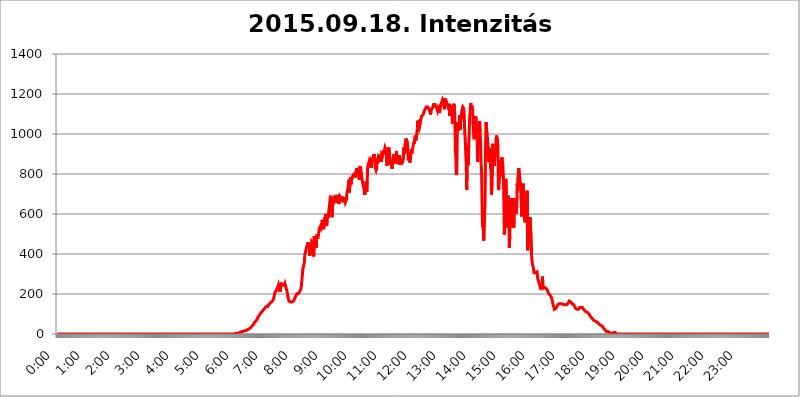
| Category | 2015.09.18. Intenzitás [W/m^2] |
|---|---|
| 0.0 | 0 |
| 0.0006944444444444445 | 0 |
| 0.001388888888888889 | 0 |
| 0.0020833333333333333 | 0 |
| 0.002777777777777778 | 0 |
| 0.003472222222222222 | 0 |
| 0.004166666666666667 | 0 |
| 0.004861111111111111 | 0 |
| 0.005555555555555556 | 0 |
| 0.0062499999999999995 | 0 |
| 0.006944444444444444 | 0 |
| 0.007638888888888889 | 0 |
| 0.008333333333333333 | 0 |
| 0.009027777777777779 | 0 |
| 0.009722222222222222 | 0 |
| 0.010416666666666666 | 0 |
| 0.011111111111111112 | 0 |
| 0.011805555555555555 | 0 |
| 0.012499999999999999 | 0 |
| 0.013194444444444444 | 0 |
| 0.013888888888888888 | 0 |
| 0.014583333333333332 | 0 |
| 0.015277777777777777 | 0 |
| 0.015972222222222224 | 0 |
| 0.016666666666666666 | 0 |
| 0.017361111111111112 | 0 |
| 0.018055555555555557 | 0 |
| 0.01875 | 0 |
| 0.019444444444444445 | 0 |
| 0.02013888888888889 | 0 |
| 0.020833333333333332 | 0 |
| 0.02152777777777778 | 0 |
| 0.022222222222222223 | 0 |
| 0.02291666666666667 | 0 |
| 0.02361111111111111 | 0 |
| 0.024305555555555556 | 0 |
| 0.024999999999999998 | 0 |
| 0.025694444444444447 | 0 |
| 0.02638888888888889 | 0 |
| 0.027083333333333334 | 0 |
| 0.027777777777777776 | 0 |
| 0.02847222222222222 | 0 |
| 0.029166666666666664 | 0 |
| 0.029861111111111113 | 0 |
| 0.030555555555555555 | 0 |
| 0.03125 | 0 |
| 0.03194444444444445 | 0 |
| 0.03263888888888889 | 0 |
| 0.03333333333333333 | 0 |
| 0.034027777777777775 | 0 |
| 0.034722222222222224 | 0 |
| 0.035416666666666666 | 0 |
| 0.036111111111111115 | 0 |
| 0.03680555555555556 | 0 |
| 0.0375 | 0 |
| 0.03819444444444444 | 0 |
| 0.03888888888888889 | 0 |
| 0.03958333333333333 | 0 |
| 0.04027777777777778 | 0 |
| 0.04097222222222222 | 0 |
| 0.041666666666666664 | 0 |
| 0.042361111111111106 | 0 |
| 0.04305555555555556 | 0 |
| 0.043750000000000004 | 0 |
| 0.044444444444444446 | 0 |
| 0.04513888888888889 | 0 |
| 0.04583333333333334 | 0 |
| 0.04652777777777778 | 0 |
| 0.04722222222222222 | 0 |
| 0.04791666666666666 | 0 |
| 0.04861111111111111 | 0 |
| 0.049305555555555554 | 0 |
| 0.049999999999999996 | 0 |
| 0.05069444444444445 | 0 |
| 0.051388888888888894 | 0 |
| 0.052083333333333336 | 0 |
| 0.05277777777777778 | 0 |
| 0.05347222222222222 | 0 |
| 0.05416666666666667 | 0 |
| 0.05486111111111111 | 0 |
| 0.05555555555555555 | 0 |
| 0.05625 | 0 |
| 0.05694444444444444 | 0 |
| 0.057638888888888885 | 0 |
| 0.05833333333333333 | 0 |
| 0.05902777777777778 | 0 |
| 0.059722222222222225 | 0 |
| 0.06041666666666667 | 0 |
| 0.061111111111111116 | 0 |
| 0.06180555555555556 | 0 |
| 0.0625 | 0 |
| 0.06319444444444444 | 0 |
| 0.06388888888888888 | 0 |
| 0.06458333333333334 | 0 |
| 0.06527777777777778 | 0 |
| 0.06597222222222222 | 0 |
| 0.06666666666666667 | 0 |
| 0.06736111111111111 | 0 |
| 0.06805555555555555 | 0 |
| 0.06874999999999999 | 0 |
| 0.06944444444444443 | 0 |
| 0.07013888888888889 | 0 |
| 0.07083333333333333 | 0 |
| 0.07152777777777779 | 0 |
| 0.07222222222222223 | 0 |
| 0.07291666666666667 | 0 |
| 0.07361111111111111 | 0 |
| 0.07430555555555556 | 0 |
| 0.075 | 0 |
| 0.07569444444444444 | 0 |
| 0.0763888888888889 | 0 |
| 0.07708333333333334 | 0 |
| 0.07777777777777778 | 0 |
| 0.07847222222222222 | 0 |
| 0.07916666666666666 | 0 |
| 0.0798611111111111 | 0 |
| 0.08055555555555556 | 0 |
| 0.08125 | 0 |
| 0.08194444444444444 | 0 |
| 0.08263888888888889 | 0 |
| 0.08333333333333333 | 0 |
| 0.08402777777777777 | 0 |
| 0.08472222222222221 | 0 |
| 0.08541666666666665 | 0 |
| 0.08611111111111112 | 0 |
| 0.08680555555555557 | 0 |
| 0.08750000000000001 | 0 |
| 0.08819444444444445 | 0 |
| 0.08888888888888889 | 0 |
| 0.08958333333333333 | 0 |
| 0.09027777777777778 | 0 |
| 0.09097222222222222 | 0 |
| 0.09166666666666667 | 0 |
| 0.09236111111111112 | 0 |
| 0.09305555555555556 | 0 |
| 0.09375 | 0 |
| 0.09444444444444444 | 0 |
| 0.09513888888888888 | 0 |
| 0.09583333333333333 | 0 |
| 0.09652777777777777 | 0 |
| 0.09722222222222222 | 0 |
| 0.09791666666666667 | 0 |
| 0.09861111111111111 | 0 |
| 0.09930555555555555 | 0 |
| 0.09999999999999999 | 0 |
| 0.10069444444444443 | 0 |
| 0.1013888888888889 | 0 |
| 0.10208333333333335 | 0 |
| 0.10277777777777779 | 0 |
| 0.10347222222222223 | 0 |
| 0.10416666666666667 | 0 |
| 0.10486111111111111 | 0 |
| 0.10555555555555556 | 0 |
| 0.10625 | 0 |
| 0.10694444444444444 | 0 |
| 0.1076388888888889 | 0 |
| 0.10833333333333334 | 0 |
| 0.10902777777777778 | 0 |
| 0.10972222222222222 | 0 |
| 0.1111111111111111 | 0 |
| 0.11180555555555556 | 0 |
| 0.11180555555555556 | 0 |
| 0.1125 | 0 |
| 0.11319444444444444 | 0 |
| 0.11388888888888889 | 0 |
| 0.11458333333333333 | 0 |
| 0.11527777777777777 | 0 |
| 0.11597222222222221 | 0 |
| 0.11666666666666665 | 0 |
| 0.1173611111111111 | 0 |
| 0.11805555555555557 | 0 |
| 0.11944444444444445 | 0 |
| 0.12013888888888889 | 0 |
| 0.12083333333333333 | 0 |
| 0.12152777777777778 | 0 |
| 0.12222222222222223 | 0 |
| 0.12291666666666667 | 0 |
| 0.12291666666666667 | 0 |
| 0.12361111111111112 | 0 |
| 0.12430555555555556 | 0 |
| 0.125 | 0 |
| 0.12569444444444444 | 0 |
| 0.12638888888888888 | 0 |
| 0.12708333333333333 | 0 |
| 0.16875 | 0 |
| 0.12847222222222224 | 0 |
| 0.12916666666666668 | 0 |
| 0.12986111111111112 | 0 |
| 0.13055555555555556 | 0 |
| 0.13125 | 0 |
| 0.13194444444444445 | 0 |
| 0.1326388888888889 | 0 |
| 0.13333333333333333 | 0 |
| 0.13402777777777777 | 0 |
| 0.13402777777777777 | 0 |
| 0.13472222222222222 | 0 |
| 0.13541666666666666 | 0 |
| 0.1361111111111111 | 0 |
| 0.13749999999999998 | 0 |
| 0.13819444444444443 | 0 |
| 0.1388888888888889 | 0 |
| 0.13958333333333334 | 0 |
| 0.14027777777777778 | 0 |
| 0.14097222222222222 | 0 |
| 0.14166666666666666 | 0 |
| 0.1423611111111111 | 0 |
| 0.14305555555555557 | 0 |
| 0.14375000000000002 | 0 |
| 0.14444444444444446 | 0 |
| 0.1451388888888889 | 0 |
| 0.1451388888888889 | 0 |
| 0.14652777777777778 | 0 |
| 0.14722222222222223 | 0 |
| 0.14791666666666667 | 0 |
| 0.1486111111111111 | 0 |
| 0.14930555555555555 | 0 |
| 0.15 | 0 |
| 0.15069444444444444 | 0 |
| 0.15138888888888888 | 0 |
| 0.15208333333333332 | 0 |
| 0.15277777777777776 | 0 |
| 0.15347222222222223 | 0 |
| 0.15416666666666667 | 0 |
| 0.15486111111111112 | 0 |
| 0.15555555555555556 | 0 |
| 0.15625 | 0 |
| 0.15694444444444444 | 0 |
| 0.15763888888888888 | 0 |
| 0.15833333333333333 | 0 |
| 0.15902777777777777 | 0 |
| 0.15972222222222224 | 0 |
| 0.16041666666666668 | 0 |
| 0.16111111111111112 | 0 |
| 0.16180555555555556 | 0 |
| 0.1625 | 0 |
| 0.16319444444444445 | 0 |
| 0.1638888888888889 | 0 |
| 0.16458333333333333 | 0 |
| 0.16527777777777777 | 0 |
| 0.16597222222222222 | 0 |
| 0.16666666666666666 | 0 |
| 0.1673611111111111 | 0 |
| 0.16805555555555554 | 0 |
| 0.16874999999999998 | 0 |
| 0.16944444444444443 | 0 |
| 0.17013888888888887 | 0 |
| 0.1708333333333333 | 0 |
| 0.17152777777777775 | 0 |
| 0.17222222222222225 | 0 |
| 0.1729166666666667 | 0 |
| 0.17361111111111113 | 0 |
| 0.17430555555555557 | 0 |
| 0.17500000000000002 | 0 |
| 0.17569444444444446 | 0 |
| 0.1763888888888889 | 0 |
| 0.17708333333333334 | 0 |
| 0.17777777777777778 | 0 |
| 0.17847222222222223 | 0 |
| 0.17916666666666667 | 0 |
| 0.1798611111111111 | 0 |
| 0.18055555555555555 | 0 |
| 0.18125 | 0 |
| 0.18194444444444444 | 0 |
| 0.1826388888888889 | 0 |
| 0.18333333333333335 | 0 |
| 0.1840277777777778 | 0 |
| 0.18472222222222223 | 0 |
| 0.18541666666666667 | 0 |
| 0.18611111111111112 | 0 |
| 0.18680555555555556 | 0 |
| 0.1875 | 0 |
| 0.18819444444444444 | 0 |
| 0.18888888888888888 | 0 |
| 0.18958333333333333 | 0 |
| 0.19027777777777777 | 0 |
| 0.1909722222222222 | 0 |
| 0.19166666666666665 | 0 |
| 0.19236111111111112 | 0 |
| 0.19305555555555554 | 0 |
| 0.19375 | 0 |
| 0.19444444444444445 | 0 |
| 0.1951388888888889 | 0 |
| 0.19583333333333333 | 0 |
| 0.19652777777777777 | 0 |
| 0.19722222222222222 | 0 |
| 0.19791666666666666 | 0 |
| 0.1986111111111111 | 0 |
| 0.19930555555555554 | 0 |
| 0.19999999999999998 | 0 |
| 0.20069444444444443 | 0 |
| 0.20138888888888887 | 0 |
| 0.2020833333333333 | 0 |
| 0.2027777777777778 | 0 |
| 0.2034722222222222 | 0 |
| 0.2041666666666667 | 0 |
| 0.20486111111111113 | 0 |
| 0.20555555555555557 | 0 |
| 0.20625000000000002 | 0 |
| 0.20694444444444446 | 0 |
| 0.2076388888888889 | 0 |
| 0.20833333333333334 | 0 |
| 0.20902777777777778 | 0 |
| 0.20972222222222223 | 0 |
| 0.21041666666666667 | 0 |
| 0.2111111111111111 | 0 |
| 0.21180555555555555 | 0 |
| 0.2125 | 0 |
| 0.21319444444444444 | 0 |
| 0.2138888888888889 | 0 |
| 0.21458333333333335 | 0 |
| 0.2152777777777778 | 0 |
| 0.21597222222222223 | 0 |
| 0.21666666666666667 | 0 |
| 0.21736111111111112 | 0 |
| 0.21805555555555556 | 0 |
| 0.21875 | 0 |
| 0.21944444444444444 | 0 |
| 0.22013888888888888 | 0 |
| 0.22083333333333333 | 0 |
| 0.22152777777777777 | 0 |
| 0.2222222222222222 | 0 |
| 0.22291666666666665 | 0 |
| 0.2236111111111111 | 0 |
| 0.22430555555555556 | 0 |
| 0.225 | 0 |
| 0.22569444444444445 | 0 |
| 0.2263888888888889 | 0 |
| 0.22708333333333333 | 0 |
| 0.22777777777777777 | 0 |
| 0.22847222222222222 | 0 |
| 0.22916666666666666 | 0 |
| 0.2298611111111111 | 0 |
| 0.23055555555555554 | 0 |
| 0.23124999999999998 | 0 |
| 0.23194444444444443 | 0 |
| 0.23263888888888887 | 0 |
| 0.2333333333333333 | 0 |
| 0.2340277777777778 | 0 |
| 0.2347222222222222 | 0 |
| 0.2354166666666667 | 0 |
| 0.23611111111111113 | 0 |
| 0.23680555555555557 | 0 |
| 0.23750000000000002 | 0 |
| 0.23819444444444446 | 0 |
| 0.2388888888888889 | 0 |
| 0.23958333333333334 | 0 |
| 0.24027777777777778 | 0 |
| 0.24097222222222223 | 0 |
| 0.24166666666666667 | 0 |
| 0.2423611111111111 | 0 |
| 0.24305555555555555 | 0 |
| 0.24375 | 0 |
| 0.24444444444444446 | 0 |
| 0.24513888888888888 | 0 |
| 0.24583333333333335 | 0 |
| 0.2465277777777778 | 0 |
| 0.24722222222222223 | 0 |
| 0.24791666666666667 | 0 |
| 0.24861111111111112 | 0 |
| 0.24930555555555556 | 0 |
| 0.25 | 3.525 |
| 0.25069444444444444 | 3.525 |
| 0.2513888888888889 | 3.525 |
| 0.2520833333333333 | 3.525 |
| 0.25277777777777777 | 7.887 |
| 0.2534722222222222 | 3.525 |
| 0.25416666666666665 | 3.525 |
| 0.2548611111111111 | 3.525 |
| 0.2555555555555556 | 3.525 |
| 0.25625000000000003 | 7.887 |
| 0.2569444444444445 | 7.887 |
| 0.2576388888888889 | 12.257 |
| 0.25833333333333336 | 12.257 |
| 0.2590277777777778 | 12.257 |
| 0.25972222222222224 | 12.257 |
| 0.2604166666666667 | 12.257 |
| 0.2611111111111111 | 12.257 |
| 0.26180555555555557 | 12.257 |
| 0.2625 | 16.636 |
| 0.26319444444444445 | 16.636 |
| 0.2638888888888889 | 16.636 |
| 0.26458333333333334 | 16.636 |
| 0.2652777777777778 | 21.024 |
| 0.2659722222222222 | 21.024 |
| 0.26666666666666666 | 21.024 |
| 0.2673611111111111 | 21.024 |
| 0.26805555555555555 | 21.024 |
| 0.26875 | 25.419 |
| 0.26944444444444443 | 25.419 |
| 0.2701388888888889 | 29.823 |
| 0.2708333333333333 | 29.823 |
| 0.27152777777777776 | 34.234 |
| 0.2722222222222222 | 34.234 |
| 0.27291666666666664 | 38.653 |
| 0.2736111111111111 | 43.079 |
| 0.2743055555555555 | 43.079 |
| 0.27499999999999997 | 47.511 |
| 0.27569444444444446 | 51.951 |
| 0.27638888888888885 | 56.398 |
| 0.27708333333333335 | 56.398 |
| 0.2777777777777778 | 60.85 |
| 0.27847222222222223 | 65.31 |
| 0.2791666666666667 | 65.31 |
| 0.2798611111111111 | 69.775 |
| 0.28055555555555556 | 74.246 |
| 0.28125 | 83.205 |
| 0.28194444444444444 | 83.205 |
| 0.2826388888888889 | 87.692 |
| 0.2833333333333333 | 92.184 |
| 0.28402777777777777 | 96.682 |
| 0.2847222222222222 | 101.184 |
| 0.28541666666666665 | 101.184 |
| 0.28611111111111115 | 105.69 |
| 0.28680555555555554 | 110.201 |
| 0.28750000000000003 | 110.201 |
| 0.2881944444444445 | 114.716 |
| 0.2888888888888889 | 119.235 |
| 0.28958333333333336 | 119.235 |
| 0.2902777777777778 | 123.758 |
| 0.29097222222222224 | 128.284 |
| 0.2916666666666667 | 128.284 |
| 0.2923611111111111 | 132.814 |
| 0.29305555555555557 | 137.347 |
| 0.29375 | 137.347 |
| 0.29444444444444445 | 137.347 |
| 0.2951388888888889 | 137.347 |
| 0.29583333333333334 | 141.884 |
| 0.2965277777777778 | 146.423 |
| 0.2972222222222222 | 150.964 |
| 0.29791666666666666 | 150.964 |
| 0.2986111111111111 | 155.509 |
| 0.29930555555555555 | 160.056 |
| 0.3 | 160.056 |
| 0.30069444444444443 | 160.056 |
| 0.3013888888888889 | 164.605 |
| 0.3020833333333333 | 164.605 |
| 0.30277777777777776 | 169.156 |
| 0.3034722222222222 | 173.709 |
| 0.30416666666666664 | 187.378 |
| 0.3048611111111111 | 201.058 |
| 0.3055555555555555 | 210.182 |
| 0.30624999999999997 | 214.746 |
| 0.3069444444444444 | 214.746 |
| 0.3076388888888889 | 219.309 |
| 0.30833333333333335 | 228.436 |
| 0.3090277777777778 | 233 |
| 0.30972222222222223 | 237.564 |
| 0.3104166666666667 | 246.689 |
| 0.3111111111111111 | 237.564 |
| 0.31180555555555556 | 233 |
| 0.3125 | 210.182 |
| 0.31319444444444444 | 228.436 |
| 0.3138888888888889 | 242.127 |
| 0.3145833333333333 | 251.251 |
| 0.31527777777777777 | 251.251 |
| 0.3159722222222222 | 255.813 |
| 0.31666666666666665 | 246.689 |
| 0.31736111111111115 | 251.251 |
| 0.31805555555555554 | 242.127 |
| 0.31875000000000003 | 242.127 |
| 0.3194444444444445 | 251.251 |
| 0.3201388888888889 | 255.813 |
| 0.32083333333333336 | 233 |
| 0.3215277777777778 | 237.564 |
| 0.32222222222222224 | 214.746 |
| 0.3229166666666667 | 196.497 |
| 0.3236111111111111 | 182.82 |
| 0.32430555555555557 | 173.709 |
| 0.325 | 164.605 |
| 0.32569444444444445 | 164.605 |
| 0.3263888888888889 | 164.605 |
| 0.32708333333333334 | 160.056 |
| 0.3277777777777778 | 160.056 |
| 0.3284722222222222 | 160.056 |
| 0.32916666666666666 | 160.056 |
| 0.3298611111111111 | 164.605 |
| 0.33055555555555555 | 164.605 |
| 0.33125 | 164.605 |
| 0.33194444444444443 | 169.156 |
| 0.3326388888888889 | 173.709 |
| 0.3333333333333333 | 182.82 |
| 0.3340277777777778 | 187.378 |
| 0.3347222222222222 | 191.937 |
| 0.3354166666666667 | 196.497 |
| 0.3361111111111111 | 201.058 |
| 0.3368055555555556 | 201.058 |
| 0.33749999999999997 | 201.058 |
| 0.33819444444444446 | 201.058 |
| 0.33888888888888885 | 205.62 |
| 0.33958333333333335 | 210.182 |
| 0.34027777777777773 | 210.182 |
| 0.34097222222222223 | 210.182 |
| 0.3416666666666666 | 223.873 |
| 0.3423611111111111 | 242.127 |
| 0.3430555555555555 | 264.932 |
| 0.34375 | 292.259 |
| 0.3444444444444445 | 324.052 |
| 0.3451388888888889 | 324.052 |
| 0.3458333333333334 | 324.052 |
| 0.34652777777777777 | 355.712 |
| 0.34722222222222227 | 396.164 |
| 0.34791666666666665 | 405.108 |
| 0.34861111111111115 | 405.108 |
| 0.34930555555555554 | 409.574 |
| 0.35000000000000003 | 440.702 |
| 0.3506944444444444 | 431.833 |
| 0.3513888888888889 | 458.38 |
| 0.3520833333333333 | 453.968 |
| 0.3527777777777778 | 440.702 |
| 0.3534722222222222 | 449.551 |
| 0.3541666666666667 | 391.685 |
| 0.3548611111111111 | 422.943 |
| 0.35555555555555557 | 418.492 |
| 0.35625 | 396.164 |
| 0.35694444444444445 | 458.38 |
| 0.3576388888888889 | 453.968 |
| 0.35833333333333334 | 449.551 |
| 0.3590277777777778 | 440.702 |
| 0.3597222222222222 | 387.202 |
| 0.36041666666666666 | 489.108 |
| 0.3611111111111111 | 471.582 |
| 0.36180555555555555 | 471.582 |
| 0.3625 | 467.187 |
| 0.36319444444444443 | 431.833 |
| 0.3638888888888889 | 489.108 |
| 0.3645833333333333 | 493.475 |
| 0.3652777777777778 | 489.108 |
| 0.3659722222222222 | 484.735 |
| 0.3666666666666667 | 484.735 |
| 0.3673611111111111 | 523.88 |
| 0.3680555555555556 | 528.2 |
| 0.36874999999999997 | 528.2 |
| 0.36944444444444446 | 541.121 |
| 0.37013888888888885 | 532.513 |
| 0.37083333333333335 | 541.121 |
| 0.37152777777777773 | 571.049 |
| 0.37222222222222223 | 575.299 |
| 0.3729166666666666 | 575.299 |
| 0.3736111111111111 | 523.88 |
| 0.3743055555555555 | 545.416 |
| 0.375 | 583.779 |
| 0.3756944444444445 | 575.299 |
| 0.3763888888888889 | 571.049 |
| 0.3770833333333334 | 600.661 |
| 0.37777777777777777 | 541.121 |
| 0.37847222222222227 | 566.793 |
| 0.37916666666666665 | 596.45 |
| 0.37986111111111115 | 579.542 |
| 0.38055555555555554 | 600.661 |
| 0.38125000000000003 | 625.784 |
| 0.3819444444444444 | 646.537 |
| 0.3826388888888889 | 675.311 |
| 0.3833333333333333 | 691.608 |
| 0.3840277777777778 | 638.256 |
| 0.3847222222222222 | 642.4 |
| 0.3854166666666667 | 583.779 |
| 0.3861111111111111 | 634.105 |
| 0.38680555555555557 | 629.948 |
| 0.3875 | 675.311 |
| 0.38819444444444445 | 679.395 |
| 0.3888888888888889 | 667.123 |
| 0.38958333333333334 | 675.311 |
| 0.3902777777777778 | 695.666 |
| 0.3909722222222222 | 675.311 |
| 0.39166666666666666 | 671.22 |
| 0.3923611111111111 | 654.791 |
| 0.39305555555555555 | 667.123 |
| 0.39375 | 695.666 |
| 0.39444444444444443 | 667.123 |
| 0.3951388888888889 | 650.667 |
| 0.3958333333333333 | 671.22 |
| 0.3965277777777778 | 687.544 |
| 0.3972222222222222 | 687.544 |
| 0.3979166666666667 | 687.544 |
| 0.3986111111111111 | 675.311 |
| 0.3993055555555556 | 687.544 |
| 0.39999999999999997 | 687.544 |
| 0.40069444444444446 | 683.473 |
| 0.40138888888888885 | 658.909 |
| 0.40208333333333335 | 683.473 |
| 0.40277777777777773 | 663.019 |
| 0.40347222222222223 | 675.311 |
| 0.4041666666666666 | 658.909 |
| 0.4048611111111111 | 658.909 |
| 0.4055555555555555 | 671.22 |
| 0.40625 | 703.762 |
| 0.4069444444444445 | 715.858 |
| 0.4076388888888889 | 711.832 |
| 0.4083333333333334 | 743.859 |
| 0.40902777777777777 | 771.559 |
| 0.40972222222222227 | 707.8 |
| 0.41041666666666665 | 755.766 |
| 0.41111111111111115 | 783.342 |
| 0.41180555555555554 | 747.834 |
| 0.41250000000000003 | 763.674 |
| 0.4131944444444444 | 775.492 |
| 0.4138888888888889 | 791.169 |
| 0.4145833333333333 | 779.42 |
| 0.4152777777777778 | 795.074 |
| 0.4159722222222222 | 795.074 |
| 0.4166666666666667 | 795.074 |
| 0.4173611111111111 | 802.868 |
| 0.41805555555555557 | 798.974 |
| 0.41875 | 783.342 |
| 0.41944444444444445 | 814.519 |
| 0.4201388888888889 | 829.981 |
| 0.42083333333333334 | 814.519 |
| 0.4215277777777778 | 814.519 |
| 0.4222222222222222 | 822.26 |
| 0.42291666666666666 | 787.258 |
| 0.4236111111111111 | 771.559 |
| 0.42430555555555555 | 791.169 |
| 0.425 | 837.682 |
| 0.42569444444444443 | 822.26 |
| 0.4263888888888889 | 806.757 |
| 0.4270833333333333 | 802.868 |
| 0.4277777777777778 | 767.62 |
| 0.4284722222222222 | 767.62 |
| 0.4291666666666667 | 743.859 |
| 0.4298611111111111 | 739.877 |
| 0.4305555555555556 | 719.877 |
| 0.43124999999999997 | 695.666 |
| 0.43194444444444446 | 711.832 |
| 0.43263888888888885 | 731.896 |
| 0.43333333333333335 | 763.674 |
| 0.43402777777777773 | 711.832 |
| 0.43472222222222223 | 759.723 |
| 0.4354166666666666 | 837.682 |
| 0.4361111111111111 | 841.526 |
| 0.4368055555555555 | 837.682 |
| 0.4375 | 864.493 |
| 0.4381944444444445 | 856.855 |
| 0.4388888888888889 | 864.493 |
| 0.4395833333333334 | 853.029 |
| 0.44027777777777777 | 829.981 |
| 0.44097222222222227 | 856.855 |
| 0.44166666666666665 | 860.676 |
| 0.44236111111111115 | 875.918 |
| 0.44305555555555554 | 872.114 |
| 0.44375000000000003 | 860.676 |
| 0.4444444444444444 | 898.668 |
| 0.4451388888888889 | 879.719 |
| 0.4458333333333333 | 837.682 |
| 0.4465277777777778 | 826.123 |
| 0.4472222222222222 | 818.392 |
| 0.4479166666666667 | 826.123 |
| 0.4486111111111111 | 879.719 |
| 0.44930555555555557 | 853.029 |
| 0.45 | 875.918 |
| 0.45069444444444445 | 891.099 |
| 0.4513888888888889 | 891.099 |
| 0.45208333333333334 | 887.309 |
| 0.4527777777777778 | 883.516 |
| 0.4534722222222222 | 891.099 |
| 0.45416666666666666 | 860.676 |
| 0.4548611111111111 | 898.668 |
| 0.45555555555555555 | 894.885 |
| 0.45625 | 891.099 |
| 0.45694444444444443 | 891.099 |
| 0.4576388888888889 | 917.534 |
| 0.4583333333333333 | 902.447 |
| 0.4590277777777778 | 921.298 |
| 0.4597222222222222 | 932.576 |
| 0.4604166666666667 | 925.06 |
| 0.4611111111111111 | 894.885 |
| 0.4618055555555556 | 913.766 |
| 0.46249999999999997 | 841.526 |
| 0.46319444444444446 | 883.516 |
| 0.46388888888888885 | 909.996 |
| 0.46458333333333335 | 925.06 |
| 0.46527777777777773 | 932.576 |
| 0.46597222222222223 | 875.918 |
| 0.4666666666666666 | 872.114 |
| 0.4673611111111111 | 879.719 |
| 0.4680555555555555 | 845.365 |
| 0.46875 | 868.305 |
| 0.4694444444444445 | 826.123 |
| 0.4701388888888889 | 853.029 |
| 0.4708333333333334 | 879.719 |
| 0.47152777777777777 | 875.918 |
| 0.47222222222222227 | 898.668 |
| 0.47291666666666665 | 879.719 |
| 0.47361111111111115 | 868.305 |
| 0.47430555555555554 | 853.029 |
| 0.47500000000000003 | 891.099 |
| 0.4756944444444444 | 913.766 |
| 0.4763888888888889 | 868.305 |
| 0.4770833333333333 | 849.199 |
| 0.4777777777777778 | 860.676 |
| 0.4784722222222222 | 868.305 |
| 0.4791666666666667 | 868.305 |
| 0.4798611111111111 | 894.885 |
| 0.48055555555555557 | 864.493 |
| 0.48125 | 875.918 |
| 0.48194444444444445 | 845.365 |
| 0.4826388888888889 | 849.199 |
| 0.48333333333333334 | 864.493 |
| 0.4840277777777778 | 853.029 |
| 0.4847222222222222 | 853.029 |
| 0.48541666666666666 | 887.309 |
| 0.4861111111111111 | 932.576 |
| 0.48680555555555555 | 909.996 |
| 0.4875 | 902.447 |
| 0.48819444444444443 | 951.327 |
| 0.4888888888888889 | 977.508 |
| 0.4895833333333333 | 973.772 |
| 0.4902777777777778 | 973.772 |
| 0.4909722222222222 | 958.814 |
| 0.4916666666666667 | 925.06 |
| 0.4923611111111111 | 868.305 |
| 0.4930555555555556 | 906.223 |
| 0.49374999999999997 | 883.516 |
| 0.49444444444444446 | 856.855 |
| 0.49513888888888885 | 864.493 |
| 0.49583333333333335 | 898.668 |
| 0.49652777777777773 | 925.06 |
| 0.49722222222222223 | 902.447 |
| 0.4979166666666666 | 917.534 |
| 0.4986111111111111 | 928.819 |
| 0.4993055555555555 | 928.819 |
| 0.5 | 958.814 |
| 0.5006944444444444 | 951.327 |
| 0.5013888888888889 | 973.772 |
| 0.5020833333333333 | 992.448 |
| 0.5027777777777778 | 966.295 |
| 0.5034722222222222 | 966.295 |
| 0.5041666666666667 | 996.182 |
| 0.5048611111111111 | 1022.323 |
| 0.5055555555555555 | 1067.267 |
| 0.50625 | 1059.756 |
| 0.5069444444444444 | 1037.277 |
| 0.5076388888888889 | 1026.06 |
| 0.5083333333333333 | 1033.537 |
| 0.5090277777777777 | 1074.789 |
| 0.5097222222222222 | 1067.267 |
| 0.5104166666666666 | 1067.267 |
| 0.5111111111111112 | 1089.873 |
| 0.5118055555555555 | 1089.873 |
| 0.5125000000000001 | 1086.097 |
| 0.5131944444444444 | 1097.437 |
| 0.513888888888889 | 1093.653 |
| 0.5145833333333333 | 1101.226 |
| 0.5152777777777778 | 1120.238 |
| 0.5159722222222222 | 1120.238 |
| 0.5166666666666667 | 1127.879 |
| 0.517361111111111 | 1135.543 |
| 0.5180555555555556 | 1135.543 |
| 0.5187499999999999 | 1131.708 |
| 0.5194444444444445 | 1135.543 |
| 0.5201388888888888 | 1135.543 |
| 0.5208333333333334 | 1131.708 |
| 0.5215277777777778 | 1124.056 |
| 0.5222222222222223 | 1116.426 |
| 0.5229166666666667 | 1116.426 |
| 0.5236111111111111 | 1097.437 |
| 0.5243055555555556 | 1120.238 |
| 0.525 | 1120.238 |
| 0.5256944444444445 | 1124.056 |
| 0.5263888888888889 | 1131.708 |
| 0.5270833333333333 | 1139.384 |
| 0.5277777777777778 | 1147.086 |
| 0.5284722222222222 | 1147.086 |
| 0.5291666666666667 | 1150.946 |
| 0.5298611111111111 | 1147.086 |
| 0.5305555555555556 | 1139.384 |
| 0.53125 | 1135.543 |
| 0.5319444444444444 | 1131.708 |
| 0.5326388888888889 | 1124.056 |
| 0.5333333333333333 | 1116.426 |
| 0.5340277777777778 | 1127.879 |
| 0.5347222222222222 | 1131.708 |
| 0.5354166666666667 | 1112.618 |
| 0.5361111111111111 | 1105.019 |
| 0.5368055555555555 | 1120.238 |
| 0.5375 | 1143.232 |
| 0.5381944444444444 | 1143.232 |
| 0.5388888888888889 | 1139.384 |
| 0.5395833333333333 | 1162.571 |
| 0.5402777777777777 | 1170.358 |
| 0.5409722222222222 | 1174.263 |
| 0.5416666666666666 | 1154.814 |
| 0.5423611111111112 | 1154.814 |
| 0.5430555555555555 | 1124.056 |
| 0.5437500000000001 | 1178.177 |
| 0.5444444444444444 | 1170.358 |
| 0.545138888888889 | 1170.358 |
| 0.5458333333333333 | 1162.571 |
| 0.5465277777777778 | 1162.571 |
| 0.5472222222222222 | 1158.689 |
| 0.5479166666666667 | 1135.543 |
| 0.548611111111111 | 1131.708 |
| 0.5493055555555556 | 1143.232 |
| 0.5499999999999999 | 1150.946 |
| 0.5506944444444445 | 1089.873 |
| 0.5513888888888888 | 1120.238 |
| 0.5520833333333334 | 1143.232 |
| 0.5527777777777778 | 1143.232 |
| 0.5534722222222223 | 1112.618 |
| 0.5541666666666667 | 1052.255 |
| 0.5548611111111111 | 1120.238 |
| 0.5555555555555556 | 1108.816 |
| 0.55625 | 1150.946 |
| 0.5569444444444445 | 1131.708 |
| 0.5576388888888889 | 1093.653 |
| 0.5583333333333333 | 928.819 |
| 0.5590277777777778 | 883.516 |
| 0.5597222222222222 | 795.074 |
| 0.5604166666666667 | 806.757 |
| 0.5611111111111111 | 1018.587 |
| 0.5618055555555556 | 1059.756 |
| 0.5625 | 1014.852 |
| 0.5631944444444444 | 1048.508 |
| 0.5638888888888889 | 1041.019 |
| 0.5645833333333333 | 1093.653 |
| 0.5652777777777778 | 1022.323 |
| 0.5659722222222222 | 1071.027 |
| 0.5666666666666667 | 1078.555 |
| 0.5673611111111111 | 1116.426 |
| 0.5680555555555555 | 1127.879 |
| 0.56875 | 1135.543 |
| 0.5694444444444444 | 1131.708 |
| 0.5701388888888889 | 1127.879 |
| 0.5708333333333333 | 1093.653 |
| 0.5715277777777777 | 1003.65 |
| 0.5722222222222222 | 977.508 |
| 0.5729166666666666 | 898.668 |
| 0.5736111111111112 | 856.855 |
| 0.5743055555555555 | 719.877 |
| 0.5750000000000001 | 864.493 |
| 0.5756944444444444 | 891.099 |
| 0.576388888888889 | 845.365 |
| 0.5770833333333333 | 947.58 |
| 0.5777777777777778 | 999.916 |
| 0.5784722222222222 | 1089.873 |
| 0.5791666666666667 | 1108.816 |
| 0.579861111111111 | 1154.814 |
| 0.5805555555555556 | 1120.238 |
| 0.5812499999999999 | 1143.232 |
| 0.5819444444444445 | 1147.086 |
| 0.5826388888888888 | 1120.238 |
| 0.5833333333333334 | 1041.019 |
| 0.5840277777777778 | 1007.383 |
| 0.5847222222222223 | 973.772 |
| 0.5854166666666667 | 1059.756 |
| 0.5861111111111111 | 1067.267 |
| 0.5868055555555556 | 1089.873 |
| 0.5875 | 1067.267 |
| 0.5881944444444445 | 1029.798 |
| 0.5888888888888889 | 992.448 |
| 0.5895833333333333 | 860.676 |
| 0.5902777777777778 | 856.855 |
| 0.5909722222222222 | 988.714 |
| 0.5916666666666667 | 1052.255 |
| 0.5923611111111111 | 1063.51 |
| 0.5930555555555556 | 1007.383 |
| 0.59375 | 966.295 |
| 0.5944444444444444 | 853.029 |
| 0.5951388888888889 | 814.519 |
| 0.5958333333333333 | 650.667 |
| 0.5965277777777778 | 536.82 |
| 0.5972222222222222 | 604.864 |
| 0.5979166666666667 | 467.187 |
| 0.5986111111111111 | 475.972 |
| 0.5993055555555555 | 583.779 |
| 0.6 | 654.791 |
| 0.6006944444444444 | 917.534 |
| 0.6013888888888889 | 1059.756 |
| 0.6020833333333333 | 1029.798 |
| 0.6027777777777777 | 1029.798 |
| 0.6034722222222222 | 977.508 |
| 0.6041666666666666 | 894.885 |
| 0.6048611111111112 | 936.33 |
| 0.6055555555555555 | 860.676 |
| 0.6062500000000001 | 913.766 |
| 0.6069444444444444 | 928.819 |
| 0.607638888888889 | 829.981 |
| 0.6083333333333333 | 822.26 |
| 0.6090277777777778 | 695.666 |
| 0.6097222222222222 | 759.723 |
| 0.6104166666666667 | 806.757 |
| 0.611111111111111 | 951.327 |
| 0.6118055555555556 | 845.365 |
| 0.6124999999999999 | 872.114 |
| 0.6131944444444445 | 841.526 |
| 0.6138888888888888 | 917.534 |
| 0.6145833333333334 | 909.996 |
| 0.6152777777777778 | 887.309 |
| 0.6159722222222223 | 992.448 |
| 0.6166666666666667 | 992.448 |
| 0.6173611111111111 | 970.034 |
| 0.6180555555555556 | 943.832 |
| 0.61875 | 719.877 |
| 0.6194444444444445 | 727.896 |
| 0.6201388888888889 | 775.492 |
| 0.6208333333333333 | 802.868 |
| 0.6215277777777778 | 787.258 |
| 0.6222222222222222 | 868.305 |
| 0.6229166666666667 | 856.855 |
| 0.6236111111111111 | 883.516 |
| 0.6243055555555556 | 883.516 |
| 0.625 | 837.682 |
| 0.6256944444444444 | 791.169 |
| 0.6263888888888889 | 671.22 |
| 0.6270833333333333 | 497.836 |
| 0.6277777777777778 | 646.537 |
| 0.6284722222222222 | 739.877 |
| 0.6291666666666667 | 775.492 |
| 0.6298611111111111 | 699.717 |
| 0.6305555555555555 | 532.513 |
| 0.63125 | 634.105 |
| 0.6319444444444444 | 600.661 |
| 0.6326388888888889 | 691.608 |
| 0.6333333333333333 | 613.252 |
| 0.6340277777777777 | 431.833 |
| 0.6347222222222222 | 493.475 |
| 0.6354166666666666 | 600.661 |
| 0.6361111111111112 | 541.121 |
| 0.6368055555555555 | 596.45 |
| 0.6375000000000001 | 679.395 |
| 0.6381944444444444 | 571.049 |
| 0.638888888888889 | 532.513 |
| 0.6395833333333333 | 588.009 |
| 0.6402777777777778 | 532.513 |
| 0.6409722222222222 | 625.784 |
| 0.6416666666666667 | 679.395 |
| 0.642361111111111 | 625.784 |
| 0.6430555555555556 | 634.105 |
| 0.6437499999999999 | 600.661 |
| 0.6444444444444445 | 638.256 |
| 0.6451388888888888 | 751.803 |
| 0.6458333333333334 | 715.858 |
| 0.6465277777777778 | 795.074 |
| 0.6472222222222223 | 829.981 |
| 0.6479166666666667 | 829.981 |
| 0.6486111111111111 | 829.981 |
| 0.6493055555555556 | 751.803 |
| 0.65 | 731.896 |
| 0.6506944444444445 | 658.909 |
| 0.6513888888888889 | 588.009 |
| 0.6520833333333333 | 727.896 |
| 0.6527777777777778 | 699.717 |
| 0.6534722222222222 | 751.803 |
| 0.6541666666666667 | 629.948 |
| 0.6548611111111111 | 679.395 |
| 0.6555555555555556 | 566.793 |
| 0.65625 | 558.261 |
| 0.6569444444444444 | 604.864 |
| 0.6576388888888889 | 675.311 |
| 0.6583333333333333 | 571.049 |
| 0.6590277777777778 | 715.858 |
| 0.6597222222222222 | 418.492 |
| 0.6604166666666667 | 436.27 |
| 0.6611111111111111 | 489.108 |
| 0.6618055555555555 | 458.38 |
| 0.6625 | 562.53 |
| 0.6631944444444444 | 583.779 |
| 0.6638888888888889 | 532.513 |
| 0.6645833333333333 | 493.475 |
| 0.6652777777777777 | 391.685 |
| 0.6659722222222222 | 360.221 |
| 0.6666666666666666 | 346.682 |
| 0.6673611111111111 | 337.639 |
| 0.6680555555555556 | 324.052 |
| 0.6687500000000001 | 305.898 |
| 0.6694444444444444 | 305.898 |
| 0.6701388888888888 | 305.898 |
| 0.6708333333333334 | 305.898 |
| 0.6715277777777778 | 305.898 |
| 0.6722222222222222 | 305.898 |
| 0.6729166666666666 | 310.44 |
| 0.6736111111111112 | 283.156 |
| 0.6743055555555556 | 269.49 |
| 0.6749999999999999 | 264.932 |
| 0.6756944444444444 | 255.813 |
| 0.6763888888888889 | 246.689 |
| 0.6770833333333334 | 237.564 |
| 0.6777777777777777 | 228.436 |
| 0.6784722222222223 | 223.873 |
| 0.6791666666666667 | 233 |
| 0.6798611111111111 | 233 |
| 0.6805555555555555 | 287.709 |
| 0.68125 | 228.436 |
| 0.6819444444444445 | 223.873 |
| 0.6826388888888889 | 228.436 |
| 0.6833333333333332 | 233 |
| 0.6840277777777778 | 233 |
| 0.6847222222222222 | 228.436 |
| 0.6854166666666667 | 228.436 |
| 0.686111111111111 | 233 |
| 0.6868055555555556 | 223.873 |
| 0.6875 | 219.309 |
| 0.6881944444444444 | 210.182 |
| 0.688888888888889 | 205.62 |
| 0.6895833333333333 | 201.058 |
| 0.6902777777777778 | 201.058 |
| 0.6909722222222222 | 196.497 |
| 0.6916666666666668 | 191.937 |
| 0.6923611111111111 | 187.378 |
| 0.6930555555555555 | 182.82 |
| 0.69375 | 173.709 |
| 0.6944444444444445 | 164.605 |
| 0.6951388888888889 | 150.964 |
| 0.6958333333333333 | 141.884 |
| 0.6965277777777777 | 132.814 |
| 0.6972222222222223 | 123.758 |
| 0.6979166666666666 | 123.758 |
| 0.6986111111111111 | 123.758 |
| 0.6993055555555556 | 128.284 |
| 0.7000000000000001 | 128.284 |
| 0.7006944444444444 | 137.347 |
| 0.7013888888888888 | 141.884 |
| 0.7020833333333334 | 146.423 |
| 0.7027777777777778 | 146.423 |
| 0.7034722222222222 | 150.964 |
| 0.7041666666666666 | 150.964 |
| 0.7048611111111112 | 150.964 |
| 0.7055555555555556 | 150.964 |
| 0.7062499999999999 | 150.964 |
| 0.7069444444444444 | 150.964 |
| 0.7076388888888889 | 150.964 |
| 0.7083333333333334 | 150.964 |
| 0.7090277777777777 | 146.423 |
| 0.7097222222222223 | 146.423 |
| 0.7104166666666667 | 146.423 |
| 0.7111111111111111 | 146.423 |
| 0.7118055555555555 | 146.423 |
| 0.7125 | 146.423 |
| 0.7131944444444445 | 146.423 |
| 0.7138888888888889 | 146.423 |
| 0.7145833333333332 | 146.423 |
| 0.7152777777777778 | 146.423 |
| 0.7159722222222222 | 146.423 |
| 0.7166666666666667 | 155.509 |
| 0.717361111111111 | 155.509 |
| 0.7180555555555556 | 164.605 |
| 0.71875 | 164.605 |
| 0.7194444444444444 | 164.605 |
| 0.720138888888889 | 160.056 |
| 0.7208333333333333 | 160.056 |
| 0.7215277777777778 | 155.509 |
| 0.7222222222222222 | 150.964 |
| 0.7229166666666668 | 146.423 |
| 0.7236111111111111 | 146.423 |
| 0.7243055555555555 | 146.423 |
| 0.725 | 141.884 |
| 0.7256944444444445 | 137.347 |
| 0.7263888888888889 | 132.814 |
| 0.7270833333333333 | 128.284 |
| 0.7277777777777777 | 128.284 |
| 0.7284722222222223 | 123.758 |
| 0.7291666666666666 | 123.758 |
| 0.7298611111111111 | 123.758 |
| 0.7305555555555556 | 123.758 |
| 0.7312500000000001 | 123.758 |
| 0.7319444444444444 | 128.284 |
| 0.7326388888888888 | 132.814 |
| 0.7333333333333334 | 137.347 |
| 0.7340277777777778 | 132.814 |
| 0.7347222222222222 | 132.814 |
| 0.7354166666666666 | 132.814 |
| 0.7361111111111112 | 132.814 |
| 0.7368055555555556 | 132.814 |
| 0.7374999999999999 | 128.284 |
| 0.7381944444444444 | 123.758 |
| 0.7388888888888889 | 119.235 |
| 0.7395833333333334 | 119.235 |
| 0.7402777777777777 | 114.716 |
| 0.7409722222222223 | 114.716 |
| 0.7416666666666667 | 114.716 |
| 0.7423611111111111 | 110.201 |
| 0.7430555555555555 | 110.201 |
| 0.74375 | 110.201 |
| 0.7444444444444445 | 105.69 |
| 0.7451388888888889 | 101.184 |
| 0.7458333333333332 | 101.184 |
| 0.7465277777777778 | 96.682 |
| 0.7472222222222222 | 92.184 |
| 0.7479166666666667 | 87.692 |
| 0.748611111111111 | 83.205 |
| 0.7493055555555556 | 83.205 |
| 0.75 | 78.722 |
| 0.7506944444444444 | 74.246 |
| 0.751388888888889 | 74.246 |
| 0.7520833333333333 | 69.775 |
| 0.7527777777777778 | 69.775 |
| 0.7534722222222222 | 65.31 |
| 0.7541666666666668 | 65.31 |
| 0.7548611111111111 | 65.31 |
| 0.7555555555555555 | 60.85 |
| 0.75625 | 60.85 |
| 0.7569444444444445 | 56.398 |
| 0.7576388888888889 | 56.398 |
| 0.7583333333333333 | 56.398 |
| 0.7590277777777777 | 51.951 |
| 0.7597222222222223 | 51.951 |
| 0.7604166666666666 | 47.511 |
| 0.7611111111111111 | 47.511 |
| 0.7618055555555556 | 47.511 |
| 0.7625000000000001 | 43.079 |
| 0.7631944444444444 | 43.079 |
| 0.7638888888888888 | 38.653 |
| 0.7645833333333334 | 38.653 |
| 0.7652777777777778 | 34.234 |
| 0.7659722222222222 | 29.823 |
| 0.7666666666666666 | 25.419 |
| 0.7673611111111112 | 25.419 |
| 0.7680555555555556 | 21.024 |
| 0.7687499999999999 | 16.636 |
| 0.7694444444444444 | 16.636 |
| 0.7701388888888889 | 12.257 |
| 0.7708333333333334 | 12.257 |
| 0.7715277777777777 | 12.257 |
| 0.7722222222222223 | 12.257 |
| 0.7729166666666667 | 7.887 |
| 0.7736111111111111 | 7.887 |
| 0.7743055555555555 | 7.887 |
| 0.775 | 7.887 |
| 0.7756944444444445 | 3.525 |
| 0.7763888888888889 | 3.525 |
| 0.7770833333333332 | 3.525 |
| 0.7777777777777778 | 3.525 |
| 0.7784722222222222 | 3.525 |
| 0.7791666666666667 | 7.887 |
| 0.779861111111111 | 7.887 |
| 0.7805555555555556 | 7.887 |
| 0.78125 | 7.887 |
| 0.7819444444444444 | 7.887 |
| 0.782638888888889 | 7.887 |
| 0.7833333333333333 | 3.525 |
| 0.7840277777777778 | 3.525 |
| 0.7847222222222222 | 0 |
| 0.7854166666666668 | 0 |
| 0.7861111111111111 | 0 |
| 0.7868055555555555 | 0 |
| 0.7875 | 0 |
| 0.7881944444444445 | 0 |
| 0.7888888888888889 | 0 |
| 0.7895833333333333 | 0 |
| 0.7902777777777777 | 0 |
| 0.7909722222222223 | 0 |
| 0.7916666666666666 | 0 |
| 0.7923611111111111 | 0 |
| 0.7930555555555556 | 0 |
| 0.7937500000000001 | 0 |
| 0.7944444444444444 | 0 |
| 0.7951388888888888 | 0 |
| 0.7958333333333334 | 0 |
| 0.7965277777777778 | 0 |
| 0.7972222222222222 | 0 |
| 0.7979166666666666 | 0 |
| 0.7986111111111112 | 0 |
| 0.7993055555555556 | 0 |
| 0.7999999999999999 | 0 |
| 0.8006944444444444 | 0 |
| 0.8013888888888889 | 0 |
| 0.8020833333333334 | 0 |
| 0.8027777777777777 | 0 |
| 0.8034722222222223 | 0 |
| 0.8041666666666667 | 0 |
| 0.8048611111111111 | 0 |
| 0.8055555555555555 | 0 |
| 0.80625 | 0 |
| 0.8069444444444445 | 0 |
| 0.8076388888888889 | 0 |
| 0.8083333333333332 | 0 |
| 0.8090277777777778 | 0 |
| 0.8097222222222222 | 0 |
| 0.8104166666666667 | 0 |
| 0.811111111111111 | 0 |
| 0.8118055555555556 | 0 |
| 0.8125 | 0 |
| 0.8131944444444444 | 0 |
| 0.813888888888889 | 0 |
| 0.8145833333333333 | 0 |
| 0.8152777777777778 | 0 |
| 0.8159722222222222 | 0 |
| 0.8166666666666668 | 0 |
| 0.8173611111111111 | 0 |
| 0.8180555555555555 | 0 |
| 0.81875 | 0 |
| 0.8194444444444445 | 0 |
| 0.8201388888888889 | 0 |
| 0.8208333333333333 | 0 |
| 0.8215277777777777 | 0 |
| 0.8222222222222223 | 0 |
| 0.8229166666666666 | 0 |
| 0.8236111111111111 | 0 |
| 0.8243055555555556 | 0 |
| 0.8250000000000001 | 0 |
| 0.8256944444444444 | 0 |
| 0.8263888888888888 | 0 |
| 0.8270833333333334 | 0 |
| 0.8277777777777778 | 0 |
| 0.8284722222222222 | 0 |
| 0.8291666666666666 | 0 |
| 0.8298611111111112 | 0 |
| 0.8305555555555556 | 0 |
| 0.8312499999999999 | 0 |
| 0.8319444444444444 | 0 |
| 0.8326388888888889 | 0 |
| 0.8333333333333334 | 0 |
| 0.8340277777777777 | 0 |
| 0.8347222222222223 | 0 |
| 0.8354166666666667 | 0 |
| 0.8361111111111111 | 0 |
| 0.8368055555555555 | 0 |
| 0.8375 | 0 |
| 0.8381944444444445 | 0 |
| 0.8388888888888889 | 0 |
| 0.8395833333333332 | 0 |
| 0.8402777777777778 | 0 |
| 0.8409722222222222 | 0 |
| 0.8416666666666667 | 0 |
| 0.842361111111111 | 0 |
| 0.8430555555555556 | 0 |
| 0.84375 | 0 |
| 0.8444444444444444 | 0 |
| 0.845138888888889 | 0 |
| 0.8458333333333333 | 0 |
| 0.8465277777777778 | 0 |
| 0.8472222222222222 | 0 |
| 0.8479166666666668 | 0 |
| 0.8486111111111111 | 0 |
| 0.8493055555555555 | 0 |
| 0.85 | 0 |
| 0.8506944444444445 | 0 |
| 0.8513888888888889 | 0 |
| 0.8520833333333333 | 0 |
| 0.8527777777777777 | 0 |
| 0.8534722222222223 | 0 |
| 0.8541666666666666 | 0 |
| 0.8548611111111111 | 0 |
| 0.8555555555555556 | 0 |
| 0.8562500000000001 | 0 |
| 0.8569444444444444 | 0 |
| 0.8576388888888888 | 0 |
| 0.8583333333333334 | 0 |
| 0.8590277777777778 | 0 |
| 0.8597222222222222 | 0 |
| 0.8604166666666666 | 0 |
| 0.8611111111111112 | 0 |
| 0.8618055555555556 | 0 |
| 0.8624999999999999 | 0 |
| 0.8631944444444444 | 0 |
| 0.8638888888888889 | 0 |
| 0.8645833333333334 | 0 |
| 0.8652777777777777 | 0 |
| 0.8659722222222223 | 0 |
| 0.8666666666666667 | 0 |
| 0.8673611111111111 | 0 |
| 0.8680555555555555 | 0 |
| 0.86875 | 0 |
| 0.8694444444444445 | 0 |
| 0.8701388888888889 | 0 |
| 0.8708333333333332 | 0 |
| 0.8715277777777778 | 0 |
| 0.8722222222222222 | 0 |
| 0.8729166666666667 | 0 |
| 0.873611111111111 | 0 |
| 0.8743055555555556 | 0 |
| 0.875 | 0 |
| 0.8756944444444444 | 0 |
| 0.876388888888889 | 0 |
| 0.8770833333333333 | 0 |
| 0.8777777777777778 | 0 |
| 0.8784722222222222 | 0 |
| 0.8791666666666668 | 0 |
| 0.8798611111111111 | 0 |
| 0.8805555555555555 | 0 |
| 0.88125 | 0 |
| 0.8819444444444445 | 0 |
| 0.8826388888888889 | 0 |
| 0.8833333333333333 | 0 |
| 0.8840277777777777 | 0 |
| 0.8847222222222223 | 0 |
| 0.8854166666666666 | 0 |
| 0.8861111111111111 | 0 |
| 0.8868055555555556 | 0 |
| 0.8875000000000001 | 0 |
| 0.8881944444444444 | 0 |
| 0.8888888888888888 | 0 |
| 0.8895833333333334 | 0 |
| 0.8902777777777778 | 0 |
| 0.8909722222222222 | 0 |
| 0.8916666666666666 | 0 |
| 0.8923611111111112 | 0 |
| 0.8930555555555556 | 0 |
| 0.8937499999999999 | 0 |
| 0.8944444444444444 | 0 |
| 0.8951388888888889 | 0 |
| 0.8958333333333334 | 0 |
| 0.8965277777777777 | 0 |
| 0.8972222222222223 | 0 |
| 0.8979166666666667 | 0 |
| 0.8986111111111111 | 0 |
| 0.8993055555555555 | 0 |
| 0.9 | 0 |
| 0.9006944444444445 | 0 |
| 0.9013888888888889 | 0 |
| 0.9020833333333332 | 0 |
| 0.9027777777777778 | 0 |
| 0.9034722222222222 | 0 |
| 0.9041666666666667 | 0 |
| 0.904861111111111 | 0 |
| 0.9055555555555556 | 0 |
| 0.90625 | 0 |
| 0.9069444444444444 | 0 |
| 0.907638888888889 | 0 |
| 0.9083333333333333 | 0 |
| 0.9090277777777778 | 0 |
| 0.9097222222222222 | 0 |
| 0.9104166666666668 | 0 |
| 0.9111111111111111 | 0 |
| 0.9118055555555555 | 0 |
| 0.9125 | 0 |
| 0.9131944444444445 | 0 |
| 0.9138888888888889 | 0 |
| 0.9145833333333333 | 0 |
| 0.9152777777777777 | 0 |
| 0.9159722222222223 | 0 |
| 0.9166666666666666 | 0 |
| 0.9173611111111111 | 0 |
| 0.9180555555555556 | 0 |
| 0.9187500000000001 | 0 |
| 0.9194444444444444 | 0 |
| 0.9201388888888888 | 0 |
| 0.9208333333333334 | 0 |
| 0.9215277777777778 | 0 |
| 0.9222222222222222 | 0 |
| 0.9229166666666666 | 0 |
| 0.9236111111111112 | 0 |
| 0.9243055555555556 | 0 |
| 0.9249999999999999 | 0 |
| 0.9256944444444444 | 0 |
| 0.9263888888888889 | 0 |
| 0.9270833333333334 | 0 |
| 0.9277777777777777 | 0 |
| 0.9284722222222223 | 0 |
| 0.9291666666666667 | 0 |
| 0.9298611111111111 | 0 |
| 0.9305555555555555 | 0 |
| 0.93125 | 0 |
| 0.9319444444444445 | 0 |
| 0.9326388888888889 | 0 |
| 0.9333333333333332 | 0 |
| 0.9340277777777778 | 0 |
| 0.9347222222222222 | 0 |
| 0.9354166666666667 | 0 |
| 0.936111111111111 | 0 |
| 0.9368055555555556 | 0 |
| 0.9375 | 0 |
| 0.9381944444444444 | 0 |
| 0.938888888888889 | 0 |
| 0.9395833333333333 | 0 |
| 0.9402777777777778 | 0 |
| 0.9409722222222222 | 0 |
| 0.9416666666666668 | 0 |
| 0.9423611111111111 | 0 |
| 0.9430555555555555 | 0 |
| 0.94375 | 0 |
| 0.9444444444444445 | 0 |
| 0.9451388888888889 | 0 |
| 0.9458333333333333 | 0 |
| 0.9465277777777777 | 0 |
| 0.9472222222222223 | 0 |
| 0.9479166666666666 | 0 |
| 0.9486111111111111 | 0 |
| 0.9493055555555556 | 0 |
| 0.9500000000000001 | 0 |
| 0.9506944444444444 | 0 |
| 0.9513888888888888 | 0 |
| 0.9520833333333334 | 0 |
| 0.9527777777777778 | 0 |
| 0.9534722222222222 | 0 |
| 0.9541666666666666 | 0 |
| 0.9548611111111112 | 0 |
| 0.9555555555555556 | 0 |
| 0.9562499999999999 | 0 |
| 0.9569444444444444 | 0 |
| 0.9576388888888889 | 0 |
| 0.9583333333333334 | 0 |
| 0.9590277777777777 | 0 |
| 0.9597222222222223 | 0 |
| 0.9604166666666667 | 0 |
| 0.9611111111111111 | 0 |
| 0.9618055555555555 | 0 |
| 0.9625 | 0 |
| 0.9631944444444445 | 0 |
| 0.9638888888888889 | 0 |
| 0.9645833333333332 | 0 |
| 0.9652777777777778 | 0 |
| 0.9659722222222222 | 0 |
| 0.9666666666666667 | 0 |
| 0.967361111111111 | 0 |
| 0.9680555555555556 | 0 |
| 0.96875 | 0 |
| 0.9694444444444444 | 0 |
| 0.970138888888889 | 0 |
| 0.9708333333333333 | 0 |
| 0.9715277777777778 | 0 |
| 0.9722222222222222 | 0 |
| 0.9729166666666668 | 0 |
| 0.9736111111111111 | 0 |
| 0.9743055555555555 | 0 |
| 0.975 | 0 |
| 0.9756944444444445 | 0 |
| 0.9763888888888889 | 0 |
| 0.9770833333333333 | 0 |
| 0.9777777777777777 | 0 |
| 0.9784722222222223 | 0 |
| 0.9791666666666666 | 0 |
| 0.9798611111111111 | 0 |
| 0.9805555555555556 | 0 |
| 0.9812500000000001 | 0 |
| 0.9819444444444444 | 0 |
| 0.9826388888888888 | 0 |
| 0.9833333333333334 | 0 |
| 0.9840277777777778 | 0 |
| 0.9847222222222222 | 0 |
| 0.9854166666666666 | 0 |
| 0.9861111111111112 | 0 |
| 0.9868055555555556 | 0 |
| 0.9874999999999999 | 0 |
| 0.9881944444444444 | 0 |
| 0.9888888888888889 | 0 |
| 0.9895833333333334 | 0 |
| 0.9902777777777777 | 0 |
| 0.9909722222222223 | 0 |
| 0.9916666666666667 | 0 |
| 0.9923611111111111 | 0 |
| 0.9930555555555555 | 0 |
| 0.99375 | 0 |
| 0.9944444444444445 | 0 |
| 0.9951388888888889 | 0 |
| 0.9958333333333332 | 0 |
| 0.9965277777777778 | 0 |
| 0.9972222222222222 | 0 |
| 0.9979166666666667 | 0 |
| 0.998611111111111 | 0 |
| 0.9993055555555556 | 0 |